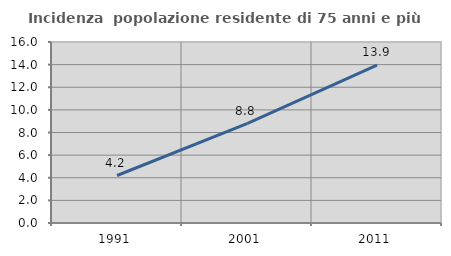
| Category | Incidenza  popolazione residente di 75 anni e più |
|---|---|
| 1991.0 | 4.198 |
| 2001.0 | 8.782 |
| 2011.0 | 13.947 |